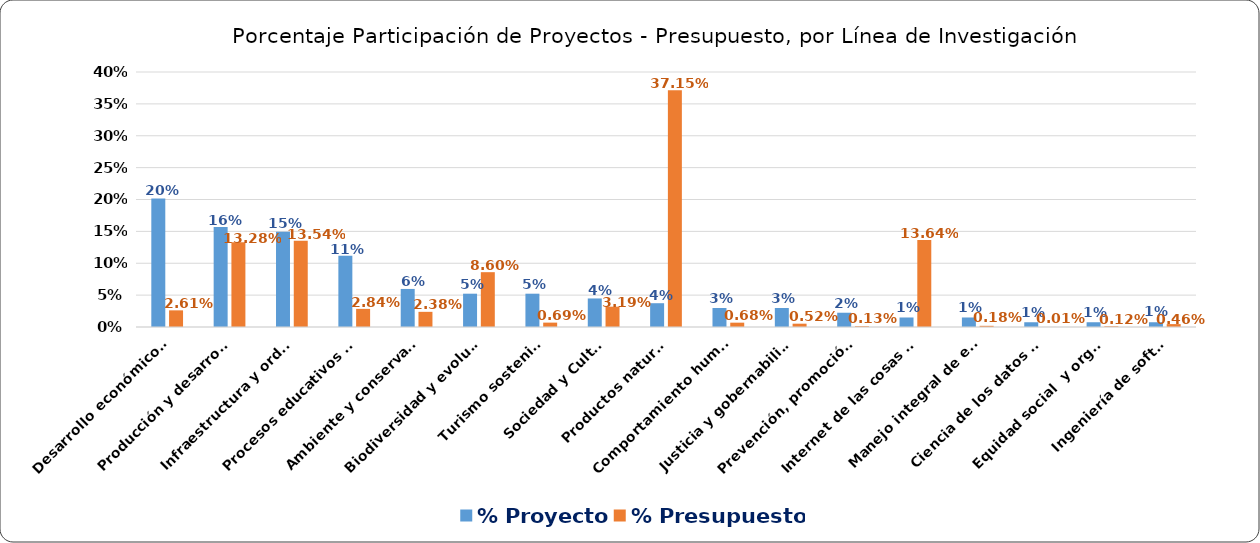
| Category | % Proyecto | % Presupuesto |
|---|---|---|
| Desarrollo económico y empresarial | 0.201 | 0.026 |
| Producción y desarrollo agroalimentario | 0.157 | 0.133 |
| Infraestructura y ordenamiento territorial | 0.149 | 0.135 |
| Procesos educativos y formación humana | 0.112 | 0.028 |
| Ambiente y conservación | 0.06 | 0.024 |
| Biodiversidad y evolución | 0.052 | 0.086 |
| Turismo sostenible | 0.052 | 0.007 |
| Sociedad y Cultura | 0.045 | 0.032 |
| Productos naturales | 0.037 | 0.371 |
| Comportamiento humano | 0.03 | 0.007 |
| Justicia y gobernabilidad | 0.03 | 0.005 |
| Prevención, promoción y cuidados | 0.022 | 0.001 |
| Internet de las cosas y cloud computing | 0.015 | 0.136 |
| Manejo integral de entidades nosológicas | 0.015 | 0.002 |
| Ciencia de los datos e inteligencia artificial | 0.007 | 0 |
| Equidad social  y organización ciudadana | 0.007 | 0.001 |
| Ingeniería de software | 0.007 | 0.005 |